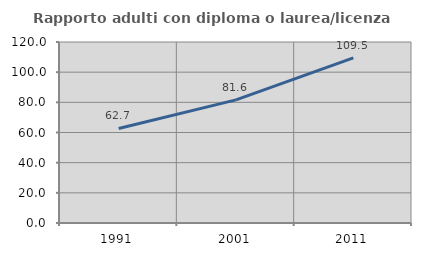
| Category | Rapporto adulti con diploma o laurea/licenza media  |
|---|---|
| 1991.0 | 62.672 |
| 2001.0 | 81.612 |
| 2011.0 | 109.5 |